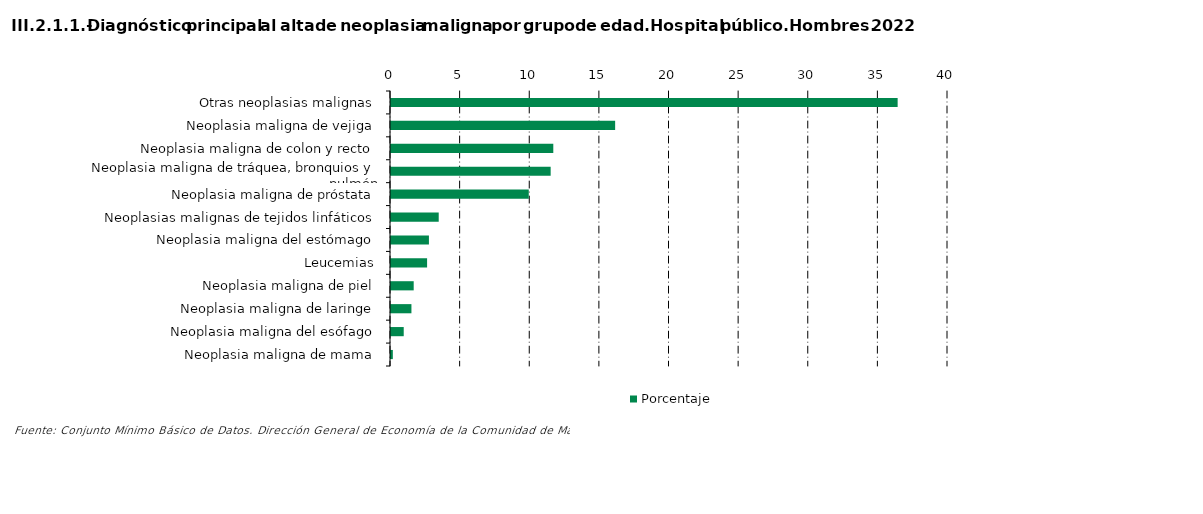
| Category | Porcentaje |
|---|---|
| Otras neoplasias malignas | 36.384 |
| Neoplasia maligna de vejiga | 16.096 |
| Neoplasia maligna de colon y recto | 11.655 |
| Neoplasia maligna de tráquea, bronquios y pulmón | 11.466 |
| Neoplasia maligna de próstata | 9.893 |
| Neoplasias malignas de tejidos linfáticos | 3.427 |
| Neoplasia maligna del estómago | 2.724 |
| Leucemias | 2.592 |
| Neoplasia maligna de piel | 1.63 |
| Neoplasia maligna de laringe | 1.467 |
| Neoplasia maligna del esófago | 0.914 |
| Neoplasia maligna de mama | 0.132 |